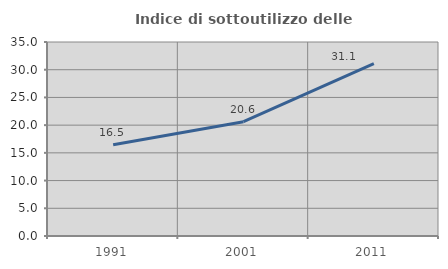
| Category | Indice di sottoutilizzo delle abitazioni  |
|---|---|
| 1991.0 | 16.456 |
| 2001.0 | 20.622 |
| 2011.0 | 31.108 |